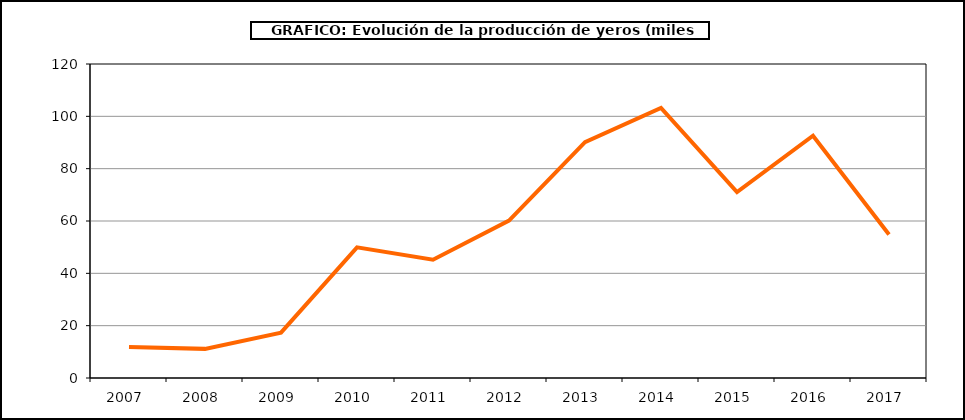
| Category | Producción |
|---|---|
| 2007.0 | 11.829 |
| 2008.0 | 11.131 |
| 2009.0 | 17.321 |
| 2010.0 | 49.937 |
| 2011.0 | 45.202 |
| 2012.0 | 60.147 |
| 2013.0 | 90.163 |
| 2014.0 | 103.242 |
| 2015.0 | 71.021 |
| 2016.0 | 92.587 |
| 2017.0 | 54.869 |